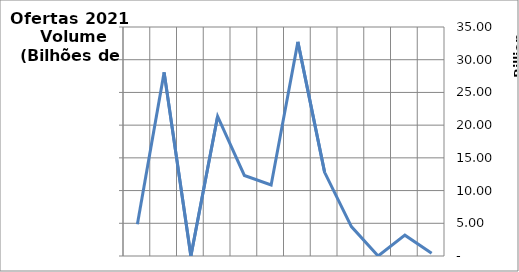
| Category | Volume (R$) |
|---|---|
| Janeiro | 4852177040 |
| Fevereiro | 28063954576.36 |
| Março | 0 |
| Abril | 21345465344.02 |
| Maio | 12314501503.32 |
| Junho | 10848127290.24 |
| Julho | 32723800034.85 |
| Agosto | 12786303440.06 |
| Setembro | 4493747343.9 |
| Outubro | 0 |
| Novembro | 3188000000 |
| Dezembro | 405680536 |